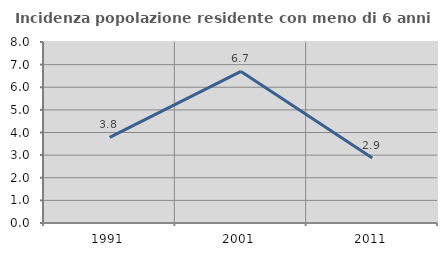
| Category | Incidenza popolazione residente con meno di 6 anni |
|---|---|
| 1991.0 | 3.784 |
| 2001.0 | 6.701 |
| 2011.0 | 2.874 |